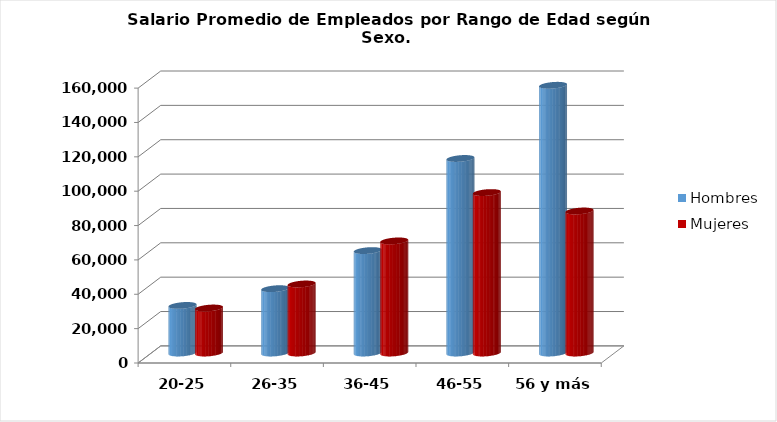
| Category | Hombres | Mujeres |
|---|---|---|
| 20-25 | 27682.667 | 26183.333 |
| 26-35 | 37440.444 | 40170.352 |
| 36-45 | 59615.269 | 65237.577 |
| 46-55 | 113228.632 | 93394.647 |
| 56 y más | 155830.1 | 82659.571 |